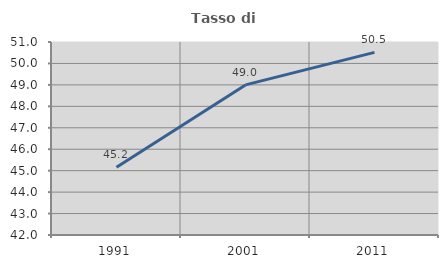
| Category | Tasso di occupazione   |
|---|---|
| 1991.0 | 45.155 |
| 2001.0 | 49 |
| 2011.0 | 50.517 |